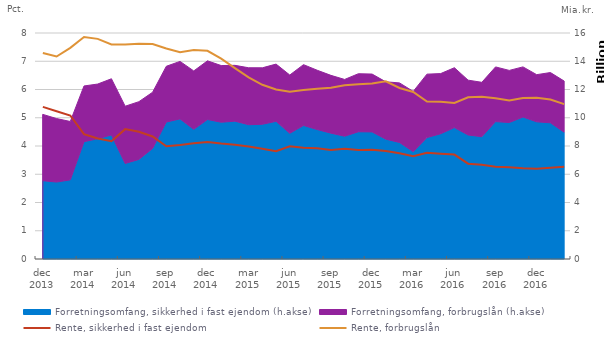
| Category | Rente, sikkerhed i fast ejendom | Rente, forbrugslån |
|---|---|---|
| dec 2013 | 5.385 | 7.289 |
| jan 2014 | 5.229 | 7.167 |
| feb 2014 | 5.079 | 7.475 |
| mar 2014 | 4.42 | 7.857 |
| apr 2014 | 4.266 | 7.792 |
| maj 2014 | 4.17 | 7.597 |
| jun 2014 | 4.597 | 7.595 |
| jul 2014 | 4.506 | 7.621 |
| aug 2014 | 4.336 | 7.61 |
| sep 2014 | 3.988 | 7.452 |
| okt 2014 | 4.031 | 7.323 |
| nov 2014 | 4.098 | 7.4 |
| dec 2014 | 4.138 | 7.37 |
| jan 2015 | 4.085 | 7.094 |
| feb 2015 | 4.045 | 6.755 |
| mar 2015 | 3.982 | 6.429 |
| apr 2015 | 3.9 | 6.167 |
| maj 2015 | 3.819 | 5.999 |
| jun 2015 | 3.992 | 5.923 |
| jul 2015 | 3.941 | 5.981 |
| aug 2015 | 3.918 | 6.027 |
| sep 2015 | 3.856 | 6.059 |
| okt 2015 | 3.907 | 6.152 |
| nov 2015 | 3.86 | 6.189 |
| dec 2015 | 3.864 | 6.212 |
| jan 2016 | 3.822 | 6.291 |
| feb 2016 | 3.743 | 6.055 |
| mar 2016 | 3.642 | 5.913 |
| apr 2016 | 3.76 | 5.572 |
| maj 2016 | 3.725 | 5.566 |
| jun 2016 | 3.697 | 5.526 |
| jul 2016 | 3.374 | 5.726 |
| aug 2016 | 3.335 | 5.741 |
| sep 2016 | 3.263 | 5.691 |
| okt 2016 | 3.247 | 5.607 |
| nov 2016 | 3.212 | 5.697 |
| dec 2016 | 3.191 | 5.707 |
| jan 2017 | 3.227 | 5.643 |
| feb 2017 | 3.265 | 5.481 |